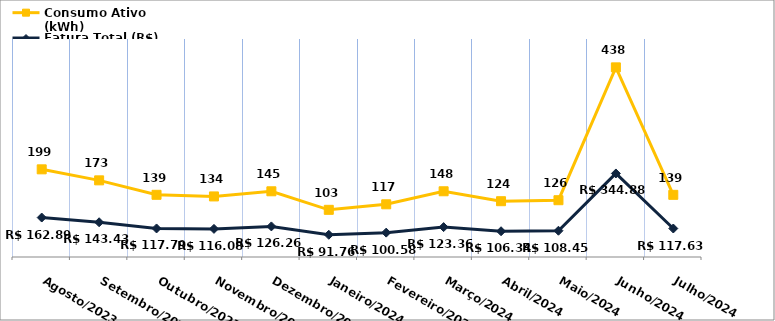
| Category | Fatura Total (R$) | Consumo Ativo (kWh) |
|---|---|---|
| Agosto/2023 | 162.89 | 199 |
| Setembro/2023 | 143.43 | 173 |
| Outubro/2023 | 117.79 | 139 |
| Novembro/2023 | 116.08 | 134 |
| Dezembro/2023 | 126.26 | 145 |
| Janeiro/2024 | 91.76 | 103 |
| Fevereiro/2024 | 100.58 | 117 |
| Março/2024 | 123.36 | 148 |
| Abril/2024 | 106.34 | 124 |
| Maio/2024 | 108.45 | 126 |
| Junho/2024 | 344.88 | 438 |
| Julho/2024 | 117.63 | 139 |